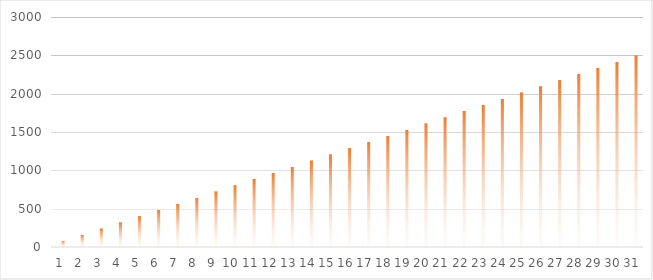
| Category | Minuten | Ziel |
|---|---|---|
| 0 | 0 | 80.645 |
| 1 | 0 | 161.29 |
| 2 | 0 | 241.935 |
| 3 | 0 | 322.581 |
| 4 | 0 | 403.226 |
| 5 | 0 | 483.871 |
| 6 | 0 | 564.516 |
| 7 | 0 | 645.161 |
| 8 | 0 | 725.806 |
| 9 | 0 | 806.452 |
| 10 | 0 | 887.097 |
| 11 | 0 | 967.742 |
| 12 | 0 | 1048.387 |
| 13 | 0 | 1129.032 |
| 14 | 0 | 1209.677 |
| 15 | 0 | 1290.323 |
| 16 | 0 | 1370.968 |
| 17 | 0 | 1451.613 |
| 18 | 0 | 1532.258 |
| 19 | 0 | 1612.903 |
| 20 | 0 | 1693.548 |
| 21 | 0 | 1774.194 |
| 22 | 0 | 1854.839 |
| 23 | 0 | 1935.484 |
| 24 | 0 | 2016.129 |
| 25 | 0 | 2096.774 |
| 26 | 0 | 2177.419 |
| 27 | 0 | 2258.065 |
| 28 | 0 | 2338.71 |
| 29 | 0 | 2419.355 |
| 30 | 0 | 2500 |